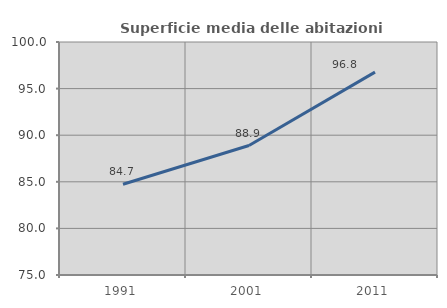
| Category | Superficie media delle abitazioni occupate |
|---|---|
| 1991.0 | 84.743 |
| 2001.0 | 88.892 |
| 2011.0 | 96.769 |